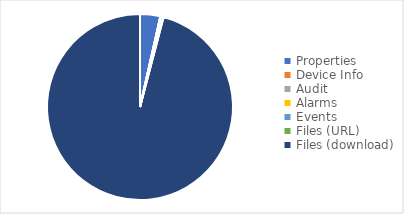
| Category | Series 0 |
|---|---|
| Properties | 4.94 |
| Device Info | 0.016 |
| Audit | 0.015 |
| Alarms | 0.097 |
| Events | 0.581 |
| Files (URL) | 0.074 |
| Files (download) | 134.496 |